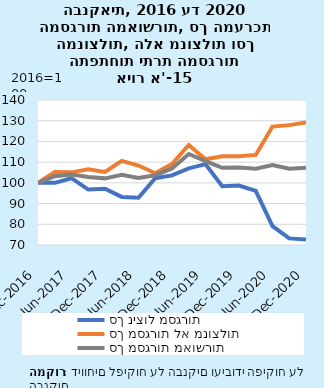
| Category | סך ניצול מסגרות  | סך מסגרות לא מנוצלות | סך מסגרות מאושרות |
|---|---|---|---|
| 2016-12-31 | 100 | 100 | 100 |
| 2017-03-31 | 99.998 | 105.18 | 103.184 |
| 2017-06-30 | 102.24 | 105.065 | 103.976 |
| 2017-09-30 | 96.766 | 106.554 | 102.783 |
| 2017-12-31 | 97.183 | 105.297 | 102.171 |
| 2018-03-31 | 93.219 | 110.638 | 103.927 |
| 2018-06-30 | 92.787 | 108.361 | 102.361 |
| 2018-09-30 | 102.236 | 104.61 | 103.695 |
| 2018-12-31 | 103.594 | 109.087 | 106.971 |
| 2019-03-31 | 107.023 | 118.261 | 113.931 |
| 2019-06-30 | 109.015 | 111.391 | 110.475 |
| 2019-09-30 | 98.42 | 112.853 | 107.293 |
| 2019-12-31 | 98.672 | 112.894 | 107.415 |
| 2020-03-31 | 96.099 | 113.478 | 106.782 |
| 2020-06-30 | 79.067 | 127.175 | 108.64 |
| 2020-09-30 | 73.183 | 127.87 | 106.8 |
| 2020-12-31 | 72.615 | 129.125 | 107.353 |